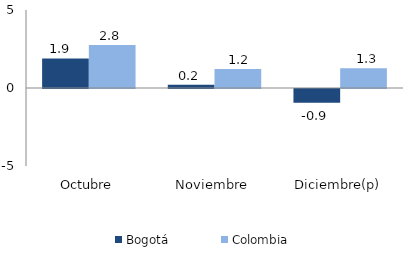
| Category | Bogotá | Colombia |
|---|---|---|
| Octubre | 1.899 | 2.762 |
| Noviembre | 0.202 | 1.221 |
| Diciembre(p) | -0.875 | 1.264 |